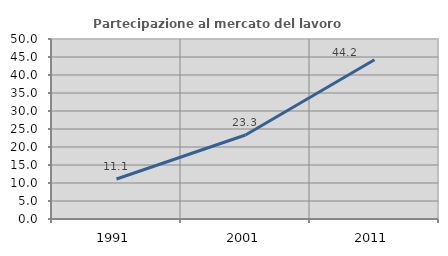
| Category | Partecipazione al mercato del lavoro  femminile |
|---|---|
| 1991.0 | 11.111 |
| 2001.0 | 23.333 |
| 2011.0 | 44.231 |